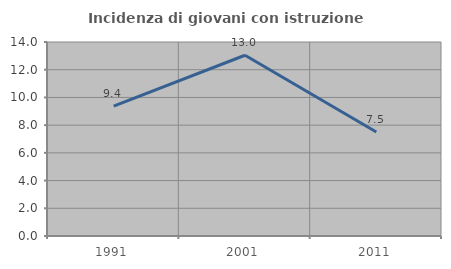
| Category | Incidenza di giovani con istruzione universitaria |
|---|---|
| 1991.0 | 9.375 |
| 2001.0 | 13.043 |
| 2011.0 | 7.5 |